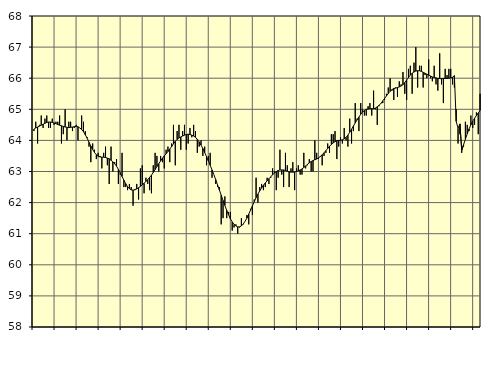
| Category | Piggar | Series 1 |
|---|---|---|
| nan | 64.3 | 64.36 |
| 1.0 | 64.6 | 64.4 |
| 1.0 | 63.9 | 64.43 |
| 1.0 | 64.5 | 64.46 |
| 1.0 | 64.8 | 64.49 |
| 1.0 | 64.4 | 64.52 |
| 1.0 | 64.7 | 64.55 |
| 1.0 | 64.8 | 64.58 |
| 1.0 | 64.4 | 64.59 |
| 1.0 | 64.4 | 64.59 |
| 1.0 | 64.7 | 64.58 |
| 1.0 | 64.5 | 64.56 |
| nan | 64.6 | 64.54 |
| 2.0 | 64.6 | 64.51 |
| 2.0 | 64.8 | 64.49 |
| 2.0 | 63.9 | 64.47 |
| 2.0 | 64.2 | 64.45 |
| 2.0 | 65 | 64.43 |
| 2.0 | 64 | 64.42 |
| 2.0 | 64.6 | 64.41 |
| 2.0 | 64.6 | 64.42 |
| 2.0 | 64.3 | 64.43 |
| 2.0 | 64.4 | 64.44 |
| 2.0 | 64.5 | 64.45 |
| nan | 64 | 64.44 |
| 3.0 | 64.4 | 64.4 |
| 3.0 | 64.8 | 64.35 |
| 3.0 | 64.6 | 64.28 |
| 3.0 | 64.3 | 64.18 |
| 3.0 | 64.1 | 64.07 |
| 3.0 | 63.8 | 63.94 |
| 3.0 | 63.3 | 63.82 |
| 3.0 | 63.9 | 63.71 |
| 3.0 | 63.7 | 63.61 |
| 3.0 | 63.4 | 63.54 |
| 3.0 | 63.6 | 63.49 |
| nan | 63.5 | 63.47 |
| 4.0 | 63.1 | 63.46 |
| 4.0 | 63.6 | 63.46 |
| 4.0 | 63.8 | 63.45 |
| 4.0 | 63.2 | 63.43 |
| 4.0 | 62.6 | 63.41 |
| 4.0 | 63.8 | 63.36 |
| 4.0 | 63 | 63.31 |
| 4.0 | 63.3 | 63.25 |
| 4.0 | 63.4 | 63.17 |
| 4.0 | 62.6 | 63.07 |
| 4.0 | 62.9 | 62.96 |
| nan | 63.6 | 62.84 |
| 5.0 | 62.5 | 62.72 |
| 5.0 | 62.5 | 62.61 |
| 5.0 | 62.4 | 62.51 |
| 5.0 | 62.6 | 62.45 |
| 5.0 | 62.5 | 62.41 |
| 5.0 | 61.9 | 62.4 |
| 5.0 | 62.4 | 62.42 |
| 5.0 | 62.6 | 62.44 |
| 5.0 | 62.1 | 62.48 |
| 5.0 | 63.1 | 62.52 |
| 5.0 | 63.2 | 62.57 |
| nan | 62.3 | 62.62 |
| 6.0 | 62.8 | 62.68 |
| 6.0 | 62.6 | 62.74 |
| 6.0 | 62.4 | 62.81 |
| 6.0 | 62.3 | 62.88 |
| 6.0 | 63.2 | 62.97 |
| 6.0 | 63.6 | 63.06 |
| 6.0 | 63.5 | 63.16 |
| 6.0 | 63 | 63.25 |
| 6.0 | 63.5 | 63.34 |
| 6.0 | 63.3 | 63.43 |
| 6.0 | 63.1 | 63.5 |
| nan | 63.7 | 63.57 |
| 7.0 | 63.8 | 63.64 |
| 7.0 | 63.3 | 63.72 |
| 7.0 | 63.9 | 63.8 |
| 7.0 | 64.5 | 63.89 |
| 7.0 | 63.2 | 63.97 |
| 7.0 | 64.3 | 64.03 |
| 7.0 | 64.5 | 64.08 |
| 7.0 | 63.7 | 64.11 |
| 7.0 | 64.3 | 64.14 |
| 7.0 | 64.5 | 64.17 |
| 7.0 | 63.7 | 64.19 |
| nan | 63.9 | 64.2 |
| 8.0 | 64.4 | 64.19 |
| 8.0 | 64.1 | 64.17 |
| 8.0 | 64.5 | 64.14 |
| 8.0 | 64.3 | 64.1 |
| 8.0 | 63.6 | 64.03 |
| 8.0 | 63.8 | 63.95 |
| 8.0 | 64 | 63.85 |
| 8.0 | 63.5 | 63.74 |
| 8.0 | 63.8 | 63.61 |
| 8.0 | 63.2 | 63.48 |
| 8.0 | 63.5 | 63.34 |
| nan | 63.6 | 63.2 |
| 9.0 | 62.8 | 63.05 |
| 9.0 | 62.9 | 62.9 |
| 9.0 | 62.6 | 62.74 |
| 9.0 | 62.5 | 62.57 |
| 9.0 | 62.5 | 62.41 |
| 9.0 | 61.3 | 62.24 |
| 9.0 | 61.5 | 62.07 |
| 9.0 | 62.2 | 61.91 |
| 9.0 | 61.5 | 61.75 |
| 9.0 | 61.7 | 61.61 |
| 9.0 | 61.7 | 61.48 |
| nan | 61.1 | 61.38 |
| 10.0 | 61.2 | 61.3 |
| 10.0 | 61.3 | 61.25 |
| 10.0 | 61 | 61.22 |
| 10.0 | 61.2 | 61.22 |
| 10.0 | 61.5 | 61.25 |
| 10.0 | 61.3 | 61.31 |
| 10.0 | 61.4 | 61.4 |
| 10.0 | 61.6 | 61.5 |
| 10.0 | 61.3 | 61.63 |
| 10.0 | 61.8 | 61.76 |
| 10.0 | 61.6 | 61.89 |
| nan | 62.1 | 62.03 |
| 11.0 | 62.8 | 62.16 |
| 11.0 | 62 | 62.27 |
| 11.0 | 62.5 | 62.38 |
| 11.0 | 62.6 | 62.47 |
| 11.0 | 62.4 | 62.56 |
| 11.0 | 62.5 | 62.63 |
| 11.0 | 62.8 | 62.7 |
| 11.0 | 62.6 | 62.77 |
| 11.0 | 62.8 | 62.83 |
| 11.0 | 63.1 | 62.9 |
| 11.0 | 63 | 62.95 |
| nan | 62.4 | 63 |
| 12.0 | 62.8 | 63.03 |
| 12.0 | 63.7 | 63.05 |
| 12.0 | 62.9 | 63.05 |
| 12.0 | 62.5 | 63.05 |
| 12.0 | 63.6 | 63.03 |
| 12.0 | 63.2 | 63.01 |
| 12.0 | 62.5 | 62.99 |
| 12.0 | 63.1 | 62.98 |
| 12.0 | 63.3 | 62.98 |
| 12.0 | 62.4 | 62.98 |
| 12.0 | 63.1 | 63 |
| nan | 63.2 | 63.02 |
| 13.0 | 62.9 | 63.05 |
| 13.0 | 62.9 | 63.08 |
| 13.0 | 63.6 | 63.13 |
| 13.0 | 63.1 | 63.18 |
| 13.0 | 63.2 | 63.23 |
| 13.0 | 63.4 | 63.28 |
| 13.0 | 63 | 63.32 |
| 13.0 | 63 | 63.35 |
| 13.0 | 64 | 63.38 |
| 13.0 | 63.6 | 63.4 |
| 13.0 | 63.4 | 63.44 |
| nan | 63.5 | 63.48 |
| 14.0 | 63.2 | 63.54 |
| 14.0 | 63.5 | 63.6 |
| 14.0 | 63.6 | 63.67 |
| 14.0 | 63.9 | 63.74 |
| 14.0 | 63.6 | 63.81 |
| 14.0 | 64.2 | 63.87 |
| 14.0 | 64.2 | 63.92 |
| 14.0 | 64.3 | 63.96 |
| 14.0 | 63.4 | 63.99 |
| 14.0 | 63.8 | 64 |
| 14.0 | 64.1 | 64 |
| nan | 63.9 | 64.02 |
| 15.0 | 64.4 | 64.05 |
| 15.0 | 64 | 64.1 |
| 15.0 | 63.8 | 64.17 |
| 15.0 | 64.7 | 64.26 |
| 15.0 | 63.9 | 64.36 |
| 15.0 | 64.3 | 64.46 |
| 15.0 | 65.2 | 64.56 |
| 15.0 | 64.7 | 64.66 |
| 15.0 | 64.3 | 64.75 |
| 15.0 | 65.2 | 64.84 |
| 15.0 | 65 | 64.91 |
| nan | 64.8 | 64.96 |
| 16.0 | 64.8 | 65 |
| 16.0 | 65.1 | 65.01 |
| 16.0 | 65.2 | 65.02 |
| 16.0 | 64.8 | 65.02 |
| 16.0 | 65.6 | 65.02 |
| 16.0 | 65 | 65.04 |
| 16.0 | 64.5 | 65.08 |
| 16.0 | 65.1 | 65.13 |
| 16.0 | 65.2 | 65.19 |
| 16.0 | 65.2 | 65.27 |
| 16.0 | 65.3 | 65.35 |
| nan | 65.5 | 65.43 |
| 17.0 | 65.7 | 65.51 |
| 17.0 | 66 | 65.58 |
| 17.0 | 65.6 | 65.63 |
| 17.0 | 65.3 | 65.67 |
| 17.0 | 65.7 | 65.68 |
| 17.0 | 65.4 | 65.7 |
| 17.0 | 65.9 | 65.72 |
| 17.0 | 65.8 | 65.75 |
| 17.0 | 66.2 | 65.79 |
| 17.0 | 65.5 | 65.86 |
| 17.0 | 65.3 | 65.94 |
| nan | 66.3 | 66.02 |
| 18.0 | 66.4 | 66.1 |
| 18.0 | 65.5 | 66.16 |
| 18.0 | 66.5 | 66.2 |
| 18.0 | 67 | 66.23 |
| 18.0 | 65.7 | 66.24 |
| 18.0 | 66.4 | 66.24 |
| 18.0 | 66.4 | 66.22 |
| 18.0 | 65.7 | 66.19 |
| 18.0 | 66.1 | 66.16 |
| 18.0 | 66 | 66.13 |
| 18.0 | 66.6 | 66.1 |
| nan | 66 | 66.07 |
| 19.0 | 65.9 | 66.04 |
| 19.0 | 66.4 | 66.02 |
| 19.0 | 65.8 | 66.01 |
| 19.0 | 65.6 | 65.99 |
| 19.0 | 66.8 | 65.99 |
| 19.0 | 65.8 | 65.98 |
| 19.0 | 65.2 | 65.99 |
| 19.0 | 66.3 | 65.99 |
| 19.0 | 66.1 | 65.99 |
| 19.0 | 66.3 | 66 |
| 19.0 | 66.3 | 66.01 |
| nan | 65.8 | 66.03 |
| 20.0 | 65.7 | 66.08 |
| 20.0 | 65 | 64.61 |
| 20.0 | 63.9 | 64.39 |
| 20.0 | 64.2 | 64.53 |
| 20.0 | 63.6 | 63.68 |
| 20.0 | 63.8 | 63.86 |
| 20.0 | 64.6 | 64.04 |
| 20.0 | 64.5 | 64.21 |
| 20.0 | 64.3 | 64.37 |
| 20.0 | 64.8 | 64.5 |
| 20.0 | 64.4 | 64.62 |
| nan | 64.5 | 64.71 |
| 21.0 | 64.9 | 64.8 |
| 21.0 | 64.2 | 64.88 |
| 21.0 | 65.5 | 64.96 |